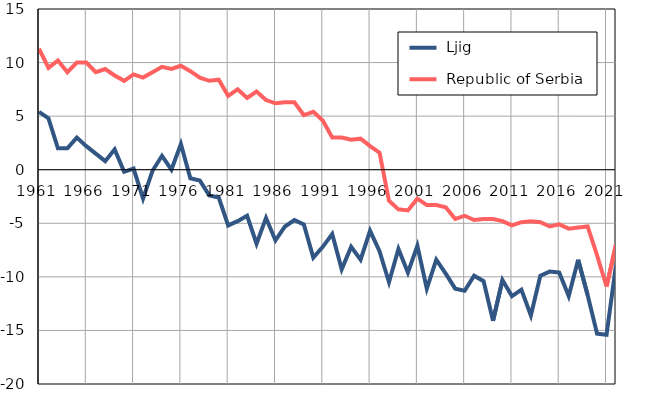
| Category |  Ljig |  Republic of Serbia |
|---|---|---|
| 1961.0 | 5.4 | 11.3 |
| 1962.0 | 4.8 | 9.5 |
| 1963.0 | 2 | 10.2 |
| 1964.0 | 2 | 9.1 |
| 1965.0 | 3 | 10 |
| 1966.0 | 2.2 | 10 |
| 1967.0 | 1.5 | 9.1 |
| 1968.0 | 0.8 | 9.4 |
| 1969.0 | 1.9 | 8.8 |
| 1970.0 | -0.2 | 8.3 |
| 1971.0 | 0.1 | 8.9 |
| 1972.0 | -2.7 | 8.6 |
| 1973.0 | -0.1 | 9.1 |
| 1974.0 | 1.3 | 9.6 |
| 1975.0 | 0 | 9.4 |
| 1976.0 | 2.4 | 9.7 |
| 1977.0 | -0.8 | 9.2 |
| 1978.0 | -1 | 8.6 |
| 1979.0 | -2.4 | 8.3 |
| 1980.0 | -2.6 | 8.4 |
| 1981.0 | -5.2 | 6.9 |
| 1982.0 | -4.8 | 7.5 |
| 1983.0 | -4.3 | 6.7 |
| 1984.0 | -6.9 | 7.3 |
| 1985.0 | -4.5 | 6.5 |
| 1986.0 | -6.6 | 6.2 |
| 1987.0 | -5.3 | 6.3 |
| 1988.0 | -4.7 | 6.3 |
| 1989.0 | -5.1 | 5.1 |
| 1990.0 | -8.2 | 5.4 |
| 1991.0 | -7.2 | 4.6 |
| 1992.0 | -6 | 3 |
| 1993.0 | -9.3 | 3 |
| 1994.0 | -7.2 | 2.8 |
| 1995.0 | -8.4 | 2.9 |
| 1996.0 | -5.7 | 2.2 |
| 1997.0 | -7.6 | 1.6 |
| 1998.0 | -10.5 | -2.9 |
| 1999.0 | -7.4 | -3.7 |
| 2000.0 | -9.6 | -3.8 |
| 2001.0 | -7.1 | -2.7 |
| 2002.0 | -11.1 | -3.3 |
| 2003.0 | -8.4 | -3.3 |
| 2004.0 | -9.7 | -3.5 |
| 2005.0 | -11.1 | -4.6 |
| 2006.0 | -11.3 | -4.3 |
| 2007.0 | -9.9 | -4.7 |
| 2008.0 | -10.4 | -4.6 |
| 2009.0 | -14.1 | -4.6 |
| 2010.0 | -10.3 | -4.8 |
| 2011.0 | -11.8 | -5.2 |
| 2012.0 | -11.2 | -4.9 |
| 2013.0 | -13.6 | -4.8 |
| 2014.0 | -9.9 | -4.9 |
| 2015.0 | -9.5 | -5.3 |
| 2016.0 | -9.6 | -5.1 |
| 2017.0 | -11.8 | -5.5 |
| 2018.0 | -8.4 | -5.4 |
| 2019.0 | -11.7 | -5.3 |
| 2020.0 | -15.3 | -8 |
| 2021.0 | -15.4 | -10.9 |
| 2022.0 | -8.9 | -7 |